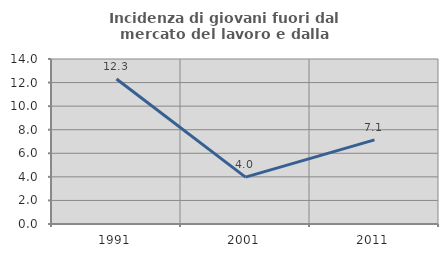
| Category | Incidenza di giovani fuori dal mercato del lavoro e dalla formazione  |
|---|---|
| 1991.0 | 12.299 |
| 2001.0 | 3.974 |
| 2011.0 | 7.143 |